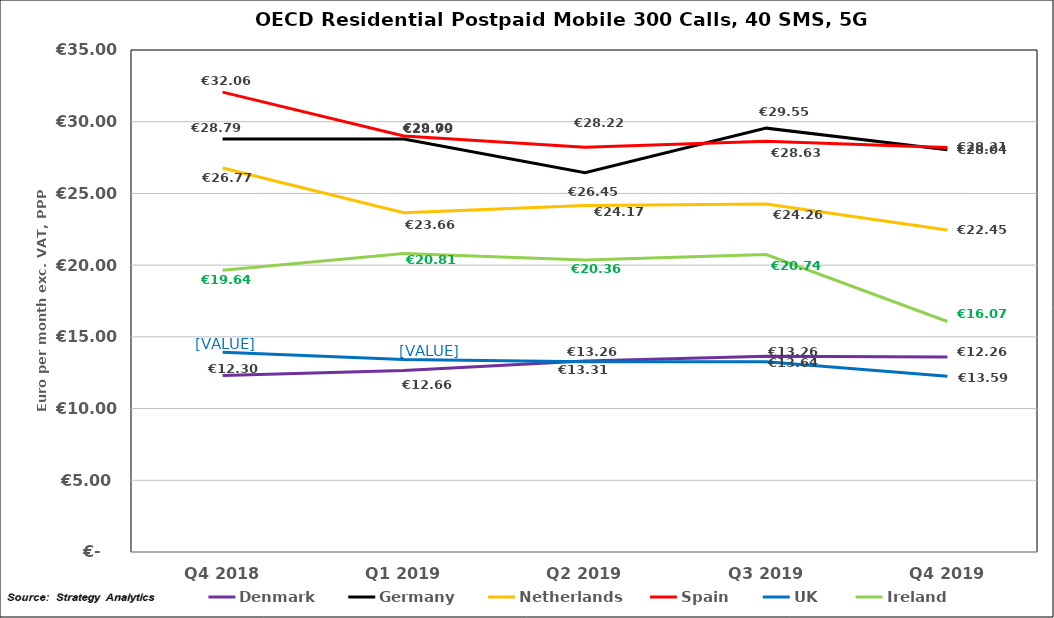
| Category | Denmark | Germany | Netherlands | Spain | UK | Ireland |
|---|---|---|---|---|---|---|
| Q4 2018 | 12.299 | 28.793 | 26.769 | 32.061 | 13.928 | 19.645 |
| Q1 2019 | 12.659 | 28.793 | 23.661 | 29 | 13.425 | 20.813 |
| Q2 2019 | 13.312 | 26.445 | 24.165 | 28.223 | 13.258 | 20.36 |
| Q3 2019 | 13.64 | 29.552 | 24.262 | 28.631 | 13.258 | 20.74 |
| Q4 2019 | 13.59 | 28.04 | 22.45 | 28.21 | 12.26 | 16.07 |